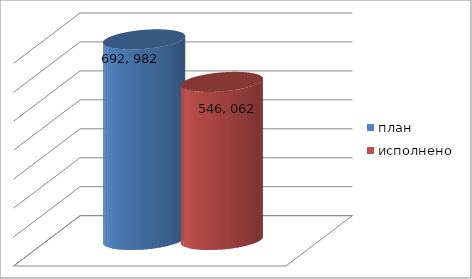
| Category | план | исполнено |
|---|---|---|
| 0 | 692982107 | 546062276.58 |